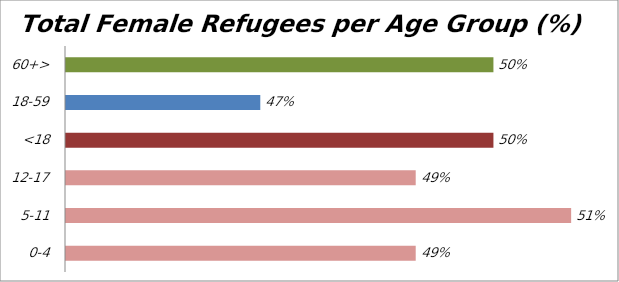
| Category | Series 19 |
|---|---|
| 0-4 | 0.49 |
| 5-11 | 0.51 |
| 12-17 | 0.49 |
| <18 | 0.5 |
| 18-59 | 0.47 |
| 60+> | 0.5 |